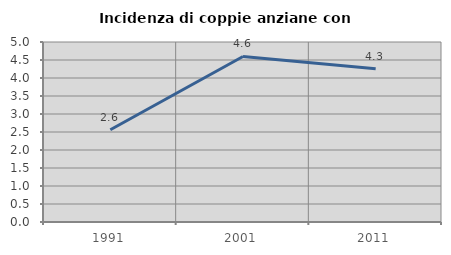
| Category | Incidenza di coppie anziane con figli |
|---|---|
| 1991.0 | 2.564 |
| 2001.0 | 4.598 |
| 2011.0 | 4.255 |